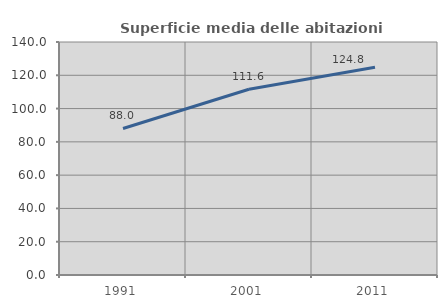
| Category | Superficie media delle abitazioni occupate |
|---|---|
| 1991.0 | 88.042 |
| 2001.0 | 111.585 |
| 2011.0 | 124.847 |